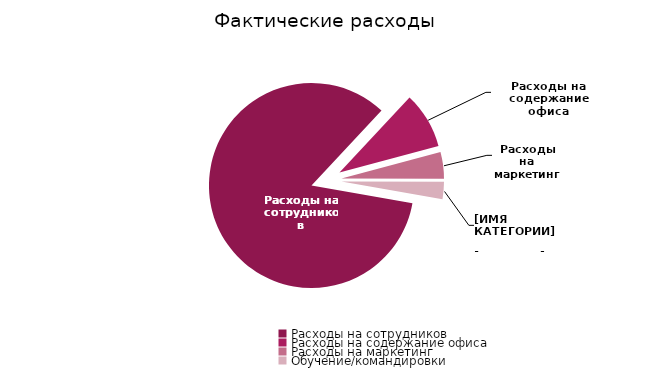
| Category | Series 0 |
|---|---|
| Расходы на сотрудников | 659130 |
| Расходы на содержание офиса | 69350 |
| Расходы на маркетинг | 33159 |
| Обучение/командировки | 21300 |